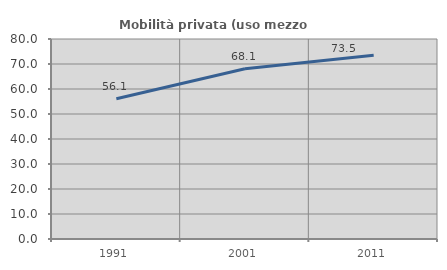
| Category | Mobilità privata (uso mezzo privato) |
|---|---|
| 1991.0 | 56.114 |
| 2001.0 | 68.115 |
| 2011.0 | 73.465 |